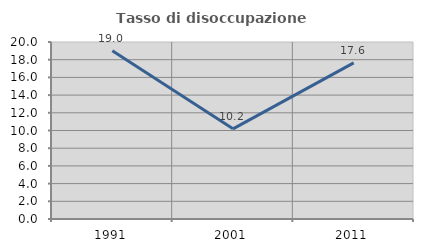
| Category | Tasso di disoccupazione giovanile  |
|---|---|
| 1991.0 | 19.014 |
| 2001.0 | 10.185 |
| 2011.0 | 17.647 |